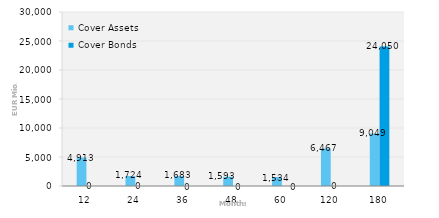
| Category | Cover Assets | Cover Bonds |
|---|---|---|
| 12.0 | 4912.853 | 0 |
| 24.0 | 1724.056 | 0 |
| 36.0 | 1683.233 | 0 |
| 48.0 | 1592.566 | 0 |
| 60.0 | 1533.527 | 0 |
| 120.0 | 6466.67 | 0 |
| 180.0 | 9048.717 | 24050 |